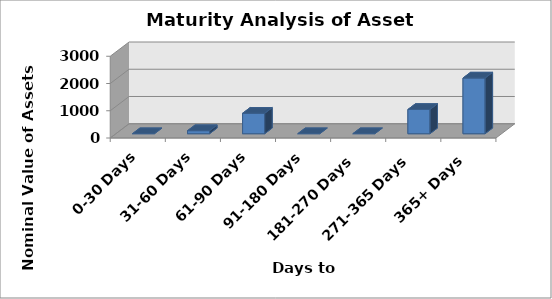
| Category | Nominal |
|---|---|
| 0-30 Days | 0 |
| 31-60 Days | 111639865.002 |
| 61-90 Days | 750000000 |
| 91-180 Days | 0 |
| 181-270 Days | 0 |
| 271-365 Days | 890050191 |
| 365+ Days | 2044435520.773 |